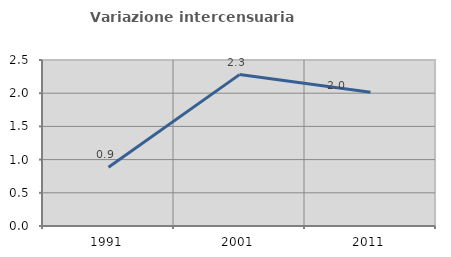
| Category | Variazione intercensuaria annua |
|---|---|
| 1991.0 | 0.886 |
| 2001.0 | 2.28 |
| 2011.0 | 2.015 |